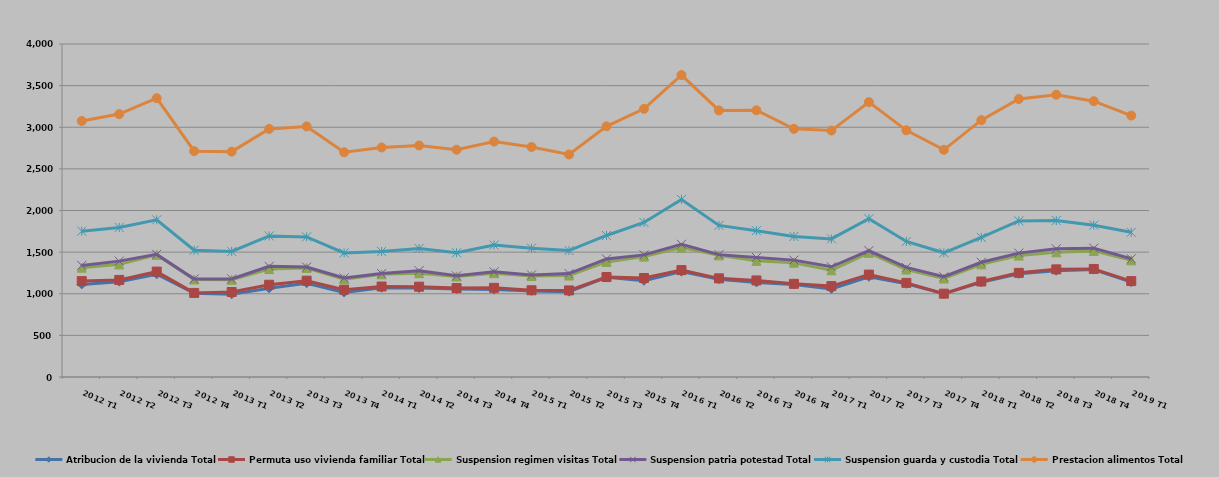
| Category | Atribucion de la vivienda Total | Permuta uso vivienda familiar Total | Suspension regimen visitas Total | Suspension patria potestad Total | Suspension guarda y custodia Total | Prestacion alimentos Total |
|---|---|---|---|---|---|---|
| 2012 T1 | 1112 | 40 | 161 | 27 | 412 | 1323 |
| 2012 T2 | 1145 | 21 | 187 | 39 | 404 | 1362 |
| 2012 T3 | 1234 | 32 | 201 | 6 | 415 | 1461 |
| 2012 T4 | 1006 | 4 | 161 | 7 | 345 | 1190 |
| 2013 T1 | 994 | 27 | 146 | 11 | 330 | 1199 |
| 2013 T2 | 1065 | 43 | 189 | 32 | 366 | 1285 |
| 2013 T3 | 1127 | 30 | 153 | 10 | 363 | 1327 |
| 2013 T4 | 1015 | 34 | 125 | 16 | 301 | 1208 |
| 2014 T1 | 1073 | 14 | 146 | 9 | 266 | 1249 |
| 2014 T2 | 1068 | 17 | 162 | 30 | 267 | 1237 |
| 2014 T3 | 1056 | 13 | 139 | 7 | 278 | 1237 |
| 2014 T4 | 1050 | 21 | 176 | 16 | 322 | 1243 |
| 2015 T1 | 1033 | 9 | 171 | 13 | 321 | 1216 |
| 2015 T2 | 1025 | 15 | 179 | 23 | 277 | 1154 |
| 2015 T3 | 1198 | 3 | 181 | 36 | 282 | 1311 |
| 2015 T4 | 1156 | 33 | 257 | 21 | 389 | 1365 |
| 2016 T1 | 1266 | 18 | 270 | 40 | 539 | 1494 |
| 2016 T2 | 1175 | 10 | 276 | 9 | 351 | 1381 |
| 2016 T3 | 1136 | 24 | 235 | 41 | 322 | 1446 |
| 2016 T4 | 1112 | 7 | 254 | 31 | 284 | 1293 |
| 2017 T1 | 1058 | 34 | 190 | 42 | 335 | 1301 |
| 2017 T2 | 1204 | 26 | 261 | 27 | 384 | 1400 |
| 2017 T3 | 1120 | 11 | 160 | 25 | 312 | 1335 |
| 2017 T4 | 1000 | 1 | 182 | 22 | 287 | 1237 |
| 2018 T1 | 1137 | 10 | 206 | 25 | 298 | 1409 |
| 2018 T2 | 1239 | 12 | 207 | 30 | 387 | 1464 |
| 2018 T3 | 1277 | 16 | 205 | 42 | 340 | 1511 |
| 2018 T4 | 1290 | 8 | 217 | 33 | 276 | 1489 |
| 2019 T1 | 1139 | 13 | 250 | 18 | 318 | 1402 |